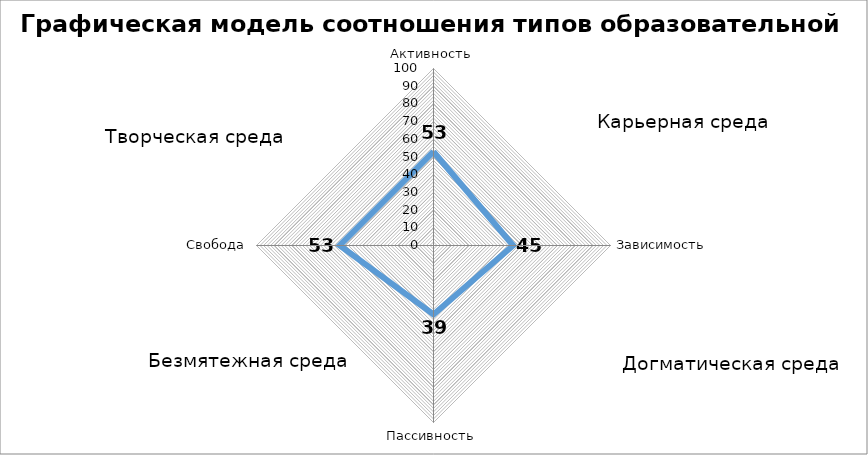
| Category | Графическая модель соотношения типов образовательной среды |
|---|---|
| Активность | 53 |
| Зависимость | 45 |
| Пассивность | 39 |
| Свобода | 53 |